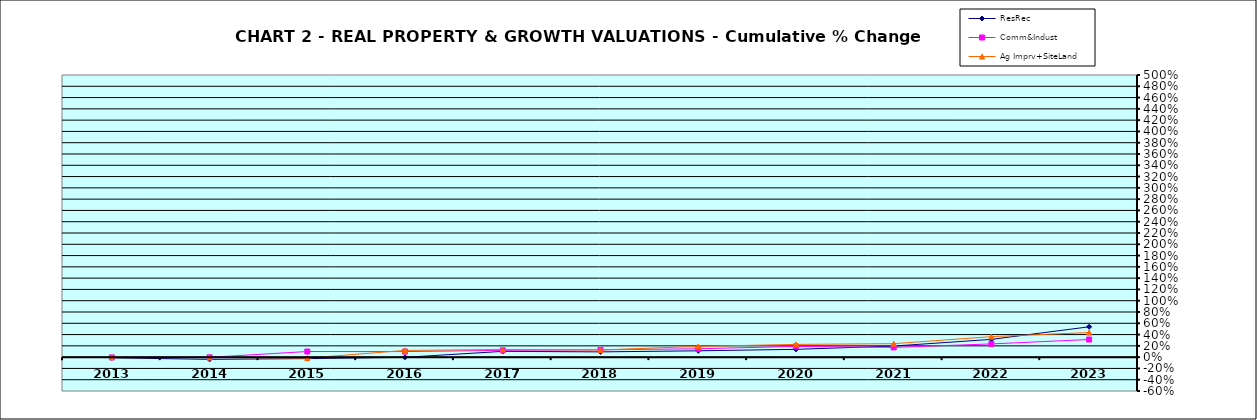
| Category | ResRec | Comm&Indust | Ag Imprv+SiteLand |
|---|---|---|---|
| 2013.0 | -0.012 | -0.005 | 0 |
| 2014.0 | -0.039 | -0.003 | -0.005 |
| 2015.0 | -0.026 | 0.1 | -0.017 |
| 2016.0 | -0.003 | 0.099 | 0.119 |
| 2017.0 | 0.102 | 0.121 | 0.135 |
| 2018.0 | 0.093 | 0.13 | 0.127 |
| 2019.0 | 0.112 | 0.148 | 0.191 |
| 2020.0 | 0.138 | 0.191 | 0.226 |
| 2021.0 | 0.196 | 0.173 | 0.239 |
| 2022.0 | 0.315 | 0.234 | 0.363 |
| 2023.0 | 0.538 | 0.312 | 0.436 |